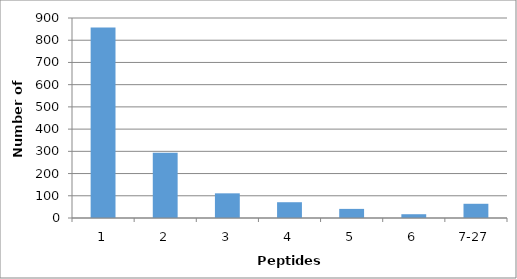
| Category | Series 0 |
|---|---|
| 1 | 857 |
| 2 | 294 |
| 3 | 111 |
| 4 | 71 |
| 5 | 41 |
| 6 | 17 |
| 7-27 | 64 |